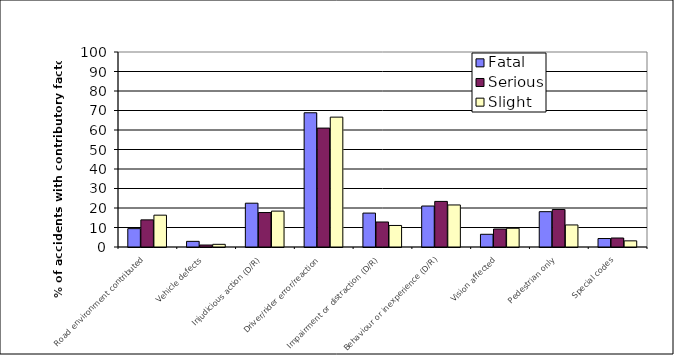
| Category | Fatal | Serious | Slight |
|---|---|---|---|
| Road environment contributed | 9.42 | 13.917 | 16.327 |
| Vehicle defects | 2.899 | 1.016 | 1.373 |
| Injudicious action (D/R) | 22.464 | 17.67 | 18.408 |
| Driver/rider error/reaction | 68.841 | 60.985 | 66.595 |
| Impairment or distraction (D/R) | 17.391 | 12.823 | 11.049 |
| Behaviour or inexperience (D/R) | 21.014 | 23.378 | 21.562 |
| Vision affected | 6.522 | 9.226 | 9.612 |
| Pedestrian only | 18.116 | 19.234 | 11.307 |
| Special codes | 4.348 | 4.613 | 3.154 |